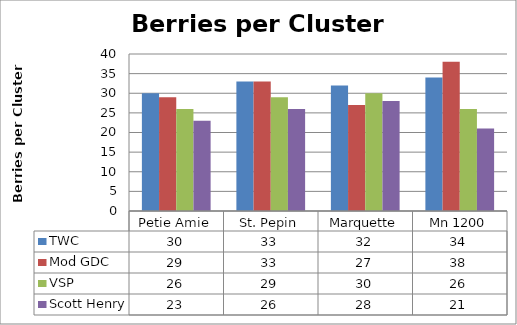
| Category | TWC | Mod GDC | VSP | Scott Henry |
|---|---|---|---|---|
| 0 | 30 | 29 | 26 | 23 |
| 1 | 33 | 33 | 29 | 26 |
| 2 | 32 | 27 | 30 | 28 |
| 3 | 34 | 38 | 26 | 21 |